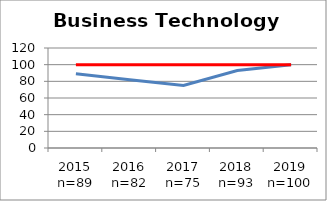
| Category | Data | Goal |
|---|---|---|
| 2015 n=89 | 89 | 100 |
| 2016 n=82 | 82 | 100 |
| 2017 n=75 | 75 | 100 |
| 2018 n=93 | 93 | 100 |
| 2019 n=100 | 100 | 100 |